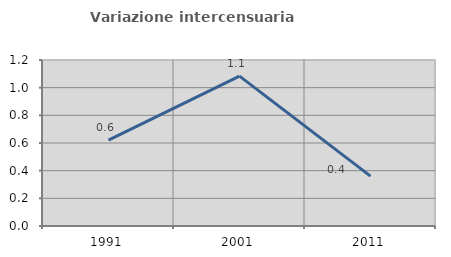
| Category | Variazione intercensuaria annua |
|---|---|
| 1991.0 | 0.621 |
| 2001.0 | 1.083 |
| 2011.0 | 0.36 |